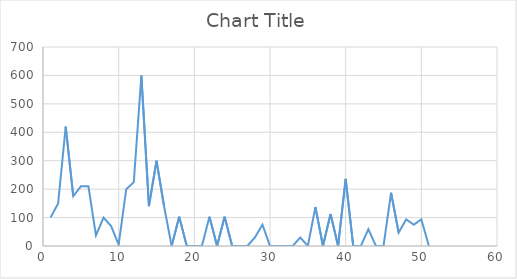
| Category | Series 0 |
|---|---|
| 1.0 | 100 |
| 2.0 | 149.8 |
| 3.0 | 420 |
| 4.0 | 175 |
| 5.0 | 210 |
| 6.0 | 210 |
| 7.0 | 37.45 |
| 8.0 | 100 |
| 9.0 | 70 |
| 10.0 | 5 |
| 11.0 | 200 |
| 12.0 | 224.7 |
| 13.0 | 599.2 |
| 14.0 | 140 |
| 15.0 | 300 |
| 16.0 | 140 |
| 17.0 | 0 |
| 18.0 | 103 |
| 19.0 | 0 |
| 20.0 | 0 |
| 21.0 | 0 |
| 22.0 | 103 |
| 23.0 | 0 |
| 24.0 | 103 |
| 25.0 | 0 |
| 26.0 | 0 |
| 27.0 | 0 |
| 28.0 | 29.96 |
| 29.0 | 74.9 |
| 30.0 | 0 |
| 31.0 | 0 |
| 32.0 | 0 |
| 33.0 | 0 |
| 34.0 | 29.96 |
| 35.0 | 0 |
| 36.0 | 137 |
| 37.0 | 0 |
| 38.0 | 112.35 |
| 39.0 | 0 |
| 40.0 | 236 |
| 41.0 | 0 |
| 42.0 | 0 |
| 43.0 | 59 |
| 44.0 | 0 |
| 45.0 | 0 |
| 46.0 | 187.25 |
| 47.0 | 47 |
| 48.0 | 93.63 |
| 49.0 | 74.9 |
| 50.0 | 93.63 |
| 51.0 | 0 |